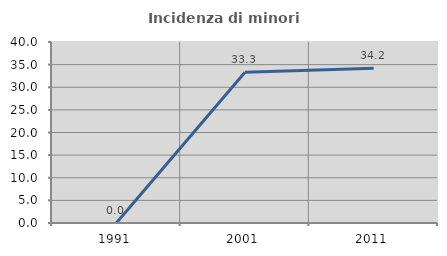
| Category | Incidenza di minori stranieri |
|---|---|
| 1991.0 | 0 |
| 2001.0 | 33.333 |
| 2011.0 | 34.211 |